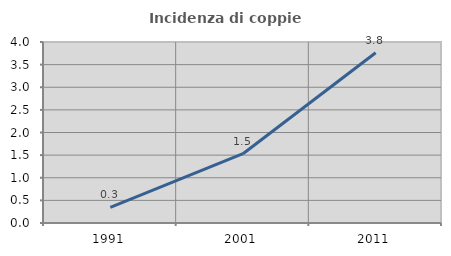
| Category | Incidenza di coppie miste |
|---|---|
| 1991.0 | 0.343 |
| 2001.0 | 1.531 |
| 2011.0 | 3.761 |